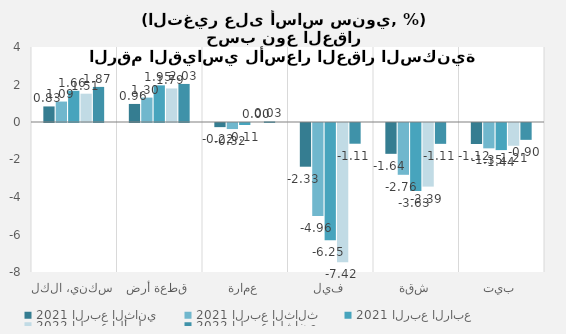
| Category | 2021 الربع الثاني | 2021 الربع الثالث | 2021 الربع الرابع | 2022 الربع الأول | 2022 الربع الثاني |
|---|---|---|---|---|---|
| سكني، الكل | 0.83 | 1.09 | 1.664 | 1.509 | 1.872 |
| قطعة أرض | 0.963 | 1.301 | 1.955 | 1.789 | 2.03 |
| عمارة | -0.22 | -0.323 | -0.108 | 0 | 0.031 |
| فيلا | -2.332 | -4.956 | -6.254 | -7.423 | -1.106 |
| شقة | -1.644 | -2.763 | -3.627 | -3.392 | -1.112 |
| بيت | -1.12 | -1.352 | -1.445 | -1.213 | -0.898 |